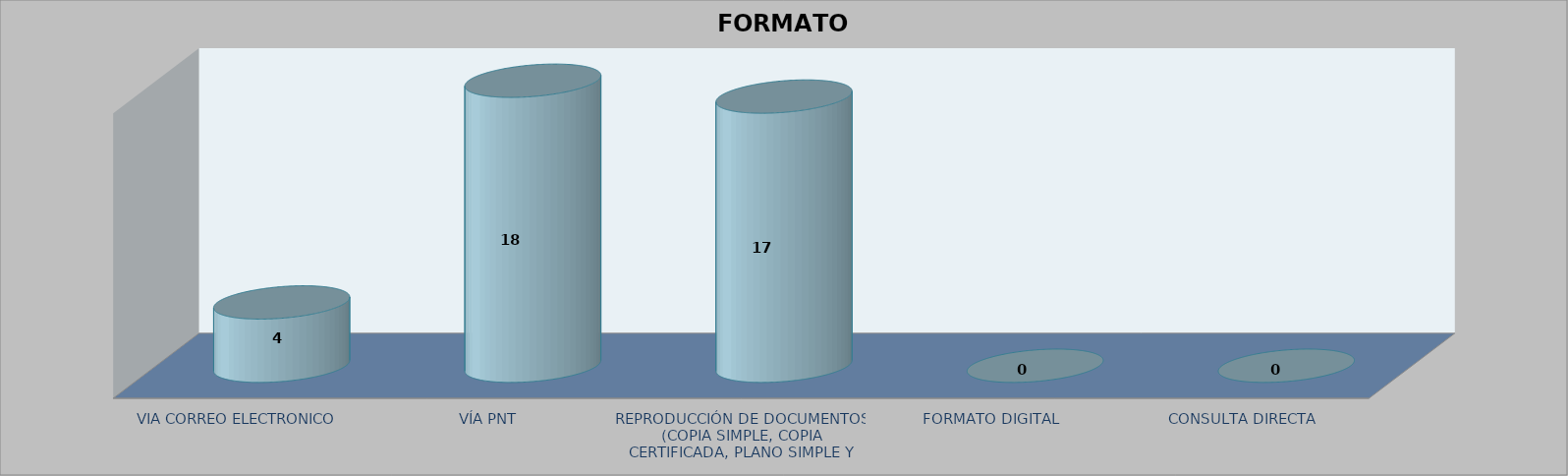
| Category |        FORMATO SOLICITADO | Series 1 | Series 2 |
|---|---|---|---|
| VIA CORREO ELECTRONICO |  |  | 4 |
| VÍA PNT |  |  | 18 |
| REPRODUCCIÓN DE DOCUMENTOS (COPIA SIMPLE, COPIA CERTIFICADA, PLANO SIMPLE Y PLANO CERTIFICADO) |  |  | 17 |
| FORMATO DIGITAL |  |  | 0 |
| CONSULTA DIRECTA |  |  | 0 |